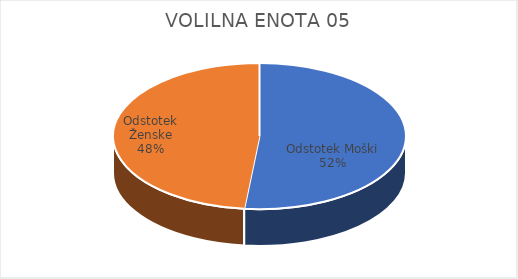
| Category | VOLILNA ENOTA 05 | #REF! | Slovenija skupaj |
|---|---|---|---|
| Odstotek Moški | 7.32 |  | 7.6 |
| Odstotek Ženske | 6.85 |  | 7.35 |